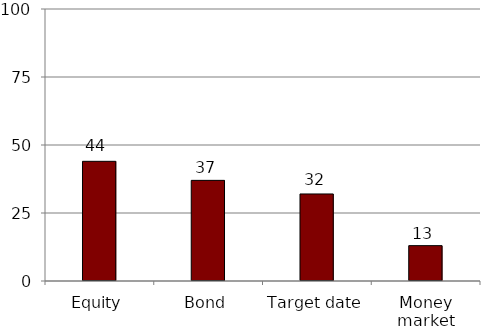
| Category | Series 0 |
|---|---|
| Equity | 44 |
| Bond | 37 |
| Target date | 32 |
| Money market | 13 |